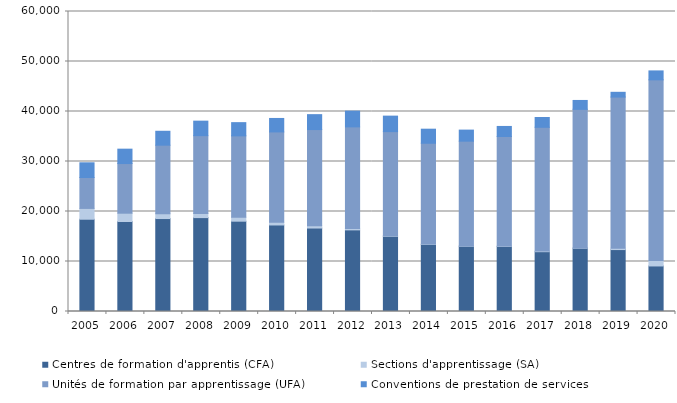
| Category | Centres de formation d'apprentis (CFA) | Sections d'apprentissage (SA) | Unités de formation par apprentissage (UFA) | Conventions de prestation de services |
|---|---|---|---|---|
| 2005.0 | 18455 | 2161 | 6188 | 2936 |
| 2006.0 | 17995 | 1665 | 9928 | 2880 |
| 2007.0 | 18591 | 970 | 13702 | 2782 |
| 2008.0 | 18779 | 805 | 15585 | 2902 |
| 2009.0 | 18062 | 782 | 16283 | 2645 |
| 2010.0 | 17304 | 526 | 18083 | 2695 |
| 2011.0 | 16694 | 439 | 19253 | 2985 |
| 2012.0 | 16323 | 276 | 20323 | 3150 |
| 2013.0 | 15050 | 108 | 20814 | 3103 |
| 2014.0 | 13425 | 78 | 20145 | 2814 |
| 2015.0 | 13046 | 47 | 20970 | 2216 |
| 2016.0 | 13022 | 75 | 21904 | 2009 |
| 2017.0 | 11961 | 129 | 24749 | 1964 |
| 2018.0 | 12653 | 22 | 27752 | 1782 |
| 2019.0 | 12387 | 283 | 30214 | 955 |
| 2020.0 | 9109 | 1095 | 36127 | 1787 |